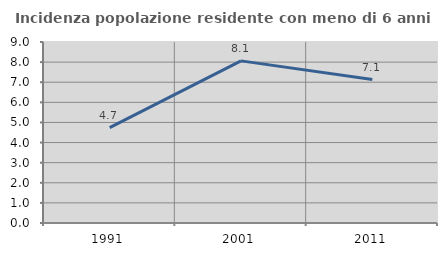
| Category | Incidenza popolazione residente con meno di 6 anni |
|---|---|
| 1991.0 | 4.744 |
| 2001.0 | 8.062 |
| 2011.0 | 7.131 |